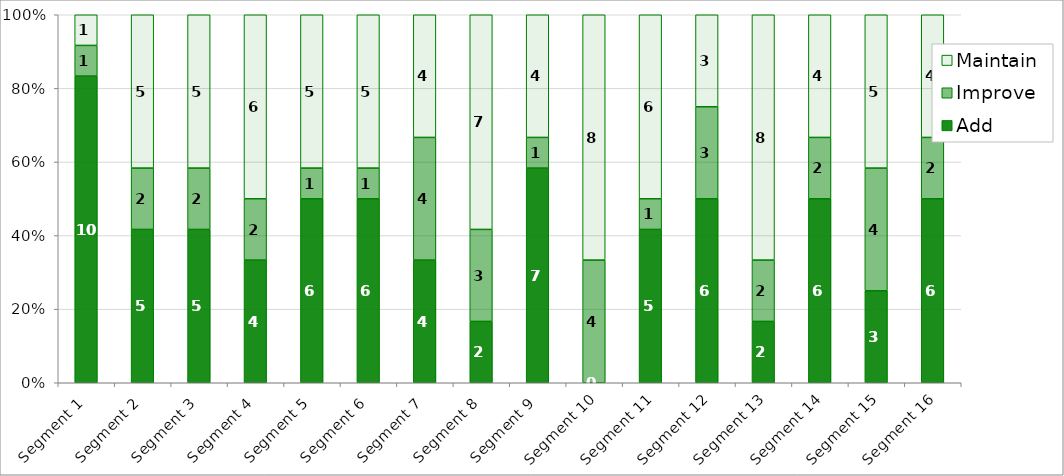
| Category | Add | Improve | Maintain |
|---|---|---|---|
| Segment 1 | 10 | 1 | 1 |
| Segment 2 | 5 | 2 | 5 |
| Segment 3 | 5 | 2 | 5 |
| Segment 4 | 4 | 2 | 6 |
| Segment 5 | 6 | 1 | 5 |
| Segment 6 | 6 | 1 | 5 |
| Segment 7 | 4 | 4 | 4 |
| Segment 8 | 2 | 3 | 7 |
| Segment 9 | 7 | 1 | 4 |
| Segment 10 | 0 | 4 | 8 |
| Segment 11 | 5 | 1 | 6 |
| Segment 12 | 6 | 3 | 3 |
| Segment 13 | 2 | 2 | 8 |
| Segment 14 | 6 | 2 | 4 |
| Segment 15 | 3 | 4 | 5 |
| Segment 16 | 6 | 2 | 4 |